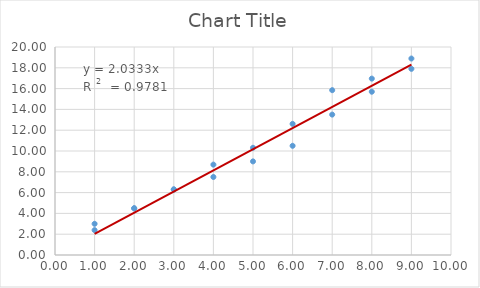
| Category | Series 0 |
|---|---|
| 1.0 | 3 |
| 2.0 | 4.5 |
| 3.0 | 6.3 |
| 4.0 | 7.5 |
| 5.0 | 9 |
| 6.0 | 10.5 |
| 7.0 | 13.5 |
| 8.0 | 15.7 |
| 9.0 | 17.9 |
| 1.0 | 2.39 |
| 2.0 | 4.48 |
| 3.0 | 6.31 |
| 4.0 | 8.69 |
| 5.0 | 10.31 |
| 6.0 | 12.61 |
| 7.0 | 15.85 |
| 8.0 | 16.96 |
| 9.0 | 18.89 |